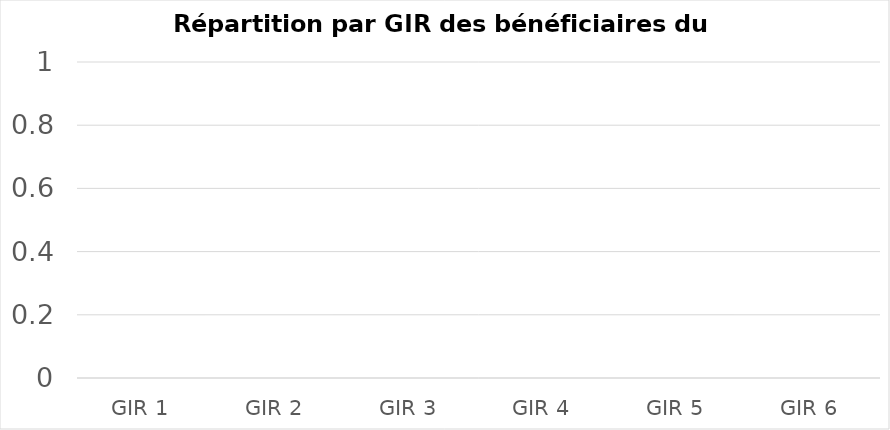
| Category | Series 0 |
|---|---|
| GIR 1 | 0 |
| GIR 2 | 0 |
| GIR 3 | 0 |
| GIR 4 | 0 |
| GIR 5 | 0 |
| GIR 6 | 0 |